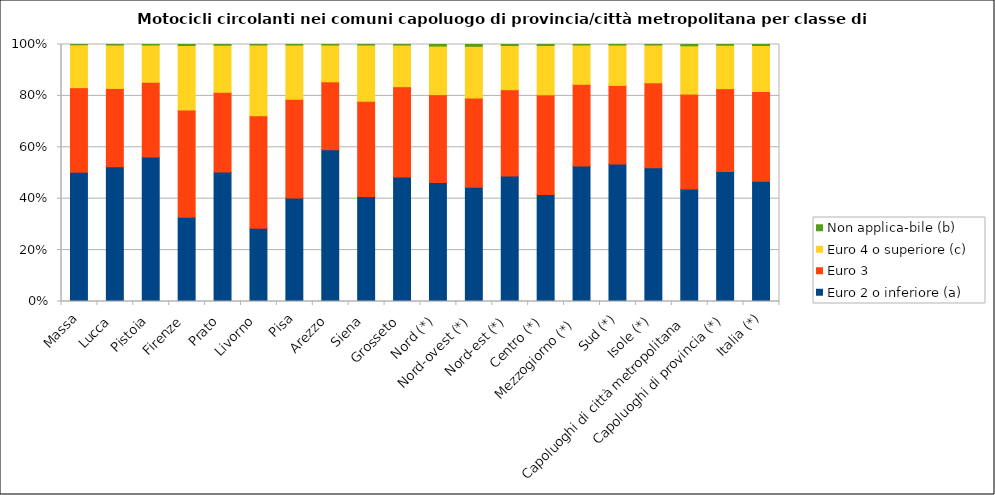
| Category | Euro 2 o inferiore (a) | Euro 3 | Euro 4 o superiore (c)  | Non applica-bile (b) |
|---|---|---|---|---|
| Massa | 50.3 | 32.9 | 16.7 | 0.1 |
| Lucca | 52.4 | 30.5 | 16.9 | 0.2 |
| Pistoia | 56.2 | 29.1 | 14.5 | 0.2 |
| Firenze | 32.8 | 41.7 | 25.1 | 0.4 |
| Prato | 50.4 | 31 | 18.3 | 0.3 |
| Livorno | 28.5 | 43.8 | 27.6 | 0.2 |
| Pisa | 40.2 | 38.4 | 21.1 | 0.2 |
| Arezzo | 59 | 26.4 | 14.3 | 0.2 |
| Siena | 40.9 | 37.1 | 21.9 | 0.2 |
| Grosseto | 48.4 | 35.1 | 16.2 | 0.2 |
| Nord (*)  | 46.3 | 34.2 | 18.9 | 0.6 |
| Nord-ovest (*) | 44.5 | 34.7 | 20.1 | 0.7 |
| Nord-est (*) | 48.9 | 33.6 | 17.2 | 0.4 |
| Centro (*) | 41.7 | 38.8 | 19.2 | 0.4 |
| Mezzogiorno (*)  | 52.8 | 31.8 | 15.3 | 0.2 |
| Sud (*) | 53.5 | 30.6 | 15.7 | 0.2 |
| Isole (*) | 52 | 33.1 | 14.7 | 0.2 |
| Capoluoghi di città metropolitana | 43.8 | 36.9 | 18.8 | 0.5 |
| Capoluoghi di provincia (*) | 50.6 | 32.3 | 16.9 | 0.3 |
| Italia (*) | 46.8 | 34.9 | 17.9 | 0.4 |